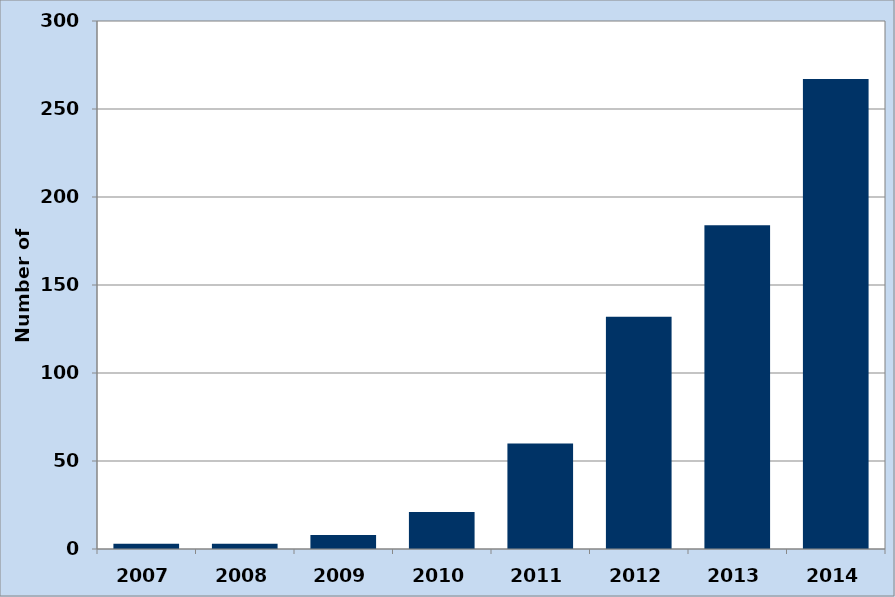
| Category | Series 0 |
|---|---|
| 2007.0 | 3 |
| 2008.0 | 3 |
| 2009.0 | 8 |
| 2010.0 | 21 |
| 2011.0 | 60 |
| 2012.0 | 132 |
| 2013.0 | 184 |
| 2014.0 | 267 |